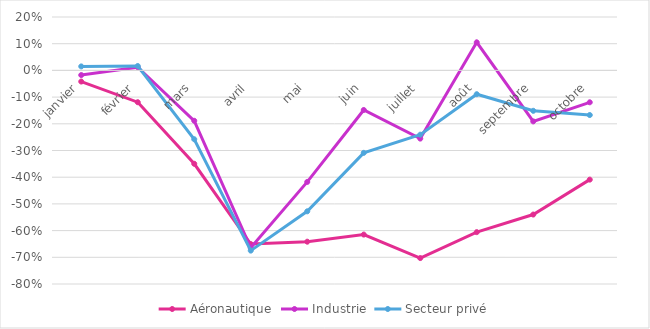
| Category | Aéronautique | Industrie | Secteur privé |
|---|---|---|---|
| janvier | -0.042 | -0.017 | 0.015 |
| février | -0.119 | 0.012 | 0.016 |
| mars | -0.35 | -0.189 | -0.258 |
| avril | -0.65 | -0.665 | -0.675 |
| mai | -0.642 | -0.418 | -0.528 |
| juin | -0.615 | -0.148 | -0.309 |
| juillet | -0.703 | -0.255 | -0.241 |
| août | -0.606 | 0.105 | -0.089 |
| septembre | -0.54 | -0.191 | -0.151 |
| octobre | -0.409 | -0.119 | -0.167 |